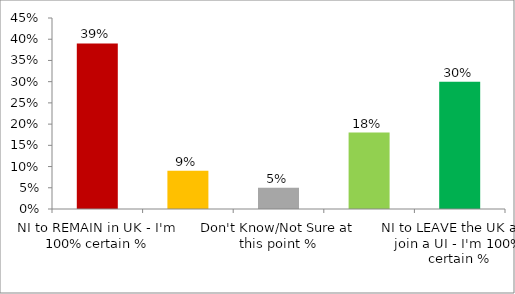
| Category | Share |
|---|---|
| NI to REMAIN in UK - I'm 100% certain % | 0.39 |
| NI to REMAIN in UK - My probable vote, but I'm not certain % | 0.09 |
| Don't Know/Not Sure at this point % | 0.05 |
| NI to LEAVE the UK and join a UI - My probable vote, but I'm not certain % | 0.18 |
| NI to LEAVE the UK and join a UI - I'm 100% certain % | 0.3 |